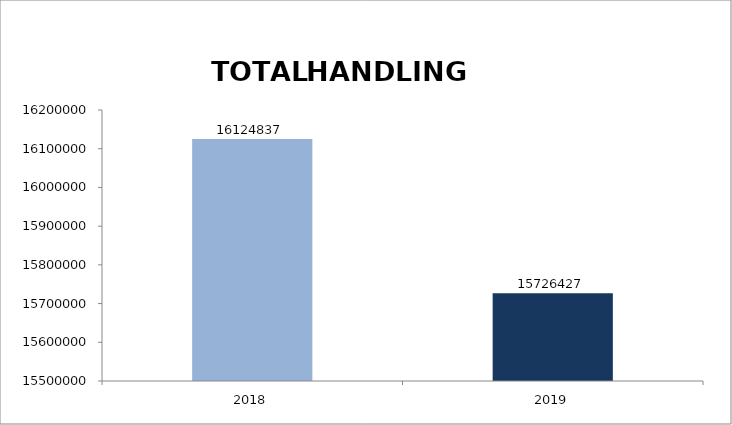
| Category | 2019 |
|---|---|
| 2018.0 | 16124837 |
| 2019.0 | 15726427 |